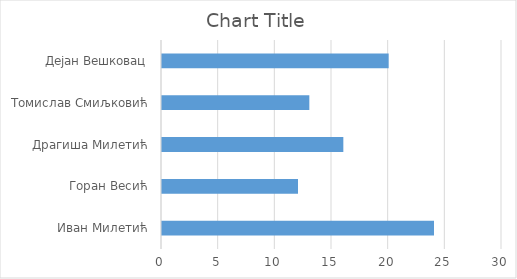
| Category | Series 0 |
|---|---|
| Иван Милетић | 24 |
| Горан Весић | 12 |
| Драгиша Милетић | 16 |
| Томислав Смиљковић | 13 |
| Дејан Вешковац | 20 |